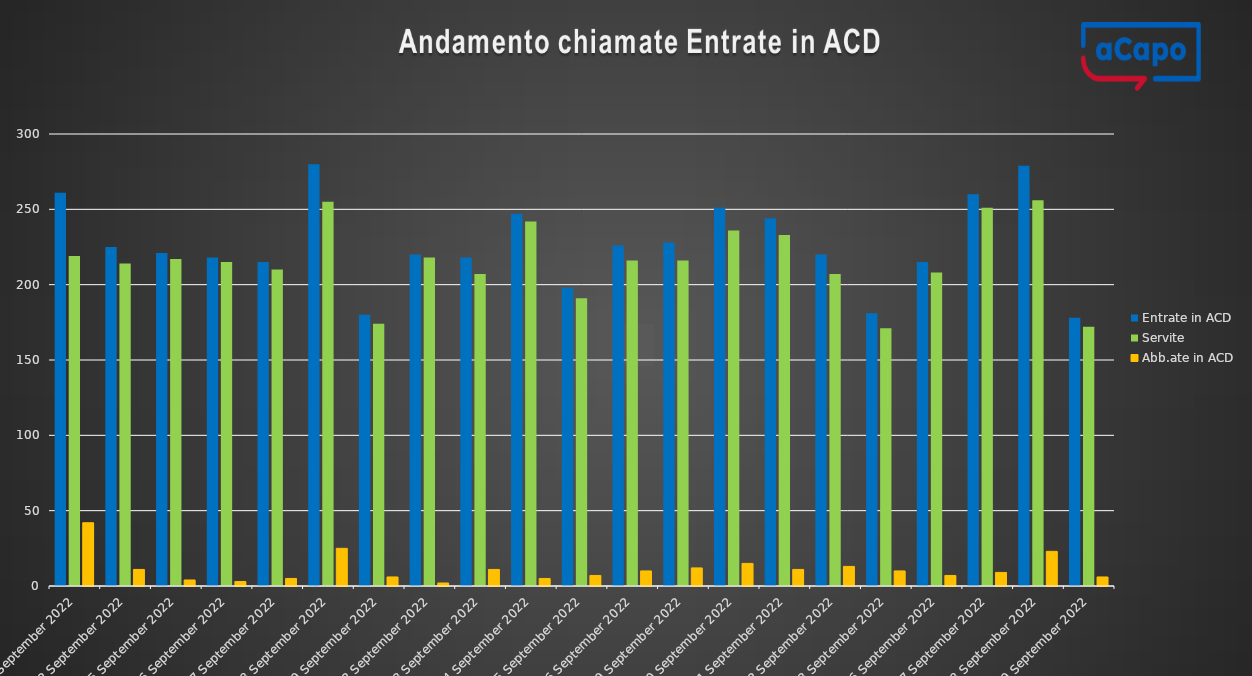
| Category | Entrate in ACD | Servite | Abb.ate in ACD |
|---|---|---|---|
| 2022-09-01 | 261 | 219 | 42 |
| 2022-09-02 | 225 | 214 | 11 |
| 2022-09-05 | 221 | 217 | 4 |
| 2022-09-06 | 218 | 215 | 3 |
| 2022-09-07 | 215 | 210 | 5 |
| 2022-09-08 | 280 | 255 | 25 |
| 2022-09-09 | 180 | 174 | 6 |
| 2022-09-12 | 220 | 218 | 2 |
| 2022-09-13 | 218 | 207 | 11 |
| 2022-09-14 | 247 | 242 | 5 |
| 2022-09-15 | 198 | 191 | 7 |
| 2022-09-16 | 226 | 216 | 10 |
| 2022-09-19 | 228 | 216 | 12 |
| 2022-09-20 | 251 | 236 | 15 |
| 2022-09-21 | 244 | 233 | 11 |
| 2022-09-22 | 220 | 207 | 13 |
| 2022-09-23 | 181 | 171 | 10 |
| 2022-09-26 | 215 | 208 | 7 |
| 2022-09-27 | 260 | 251 | 9 |
| 2022-09-28 | 279 | 256 | 23 |
| 2022-09-29 | 178 | 172 | 6 |